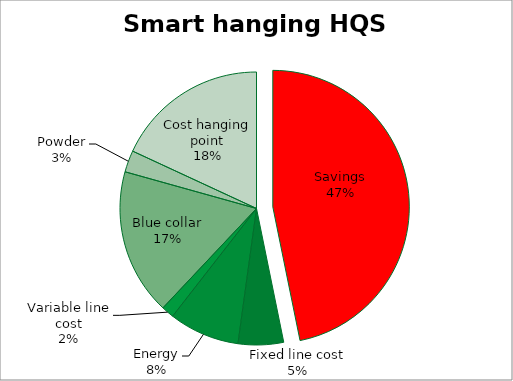
| Category | Savings |
|---|---|
| Savings | 0.468 |
| Fixed line cost | 0.054 |
| Energy | 0.084 |
| Variable line cost | 0.015 |
| Blue collar | 0.173 |
| Powder | 0.026 |
| Cost hanging point | 0.181 |